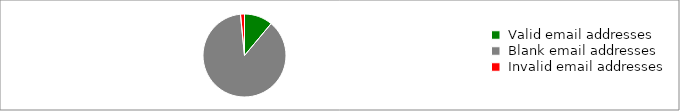
| Category | Series 0 |
|---|---|
|  Valid email addresses  | 8446 |
|  Blank email addresses  | 66675 |
|  Invalid email addresses  | 1182 |